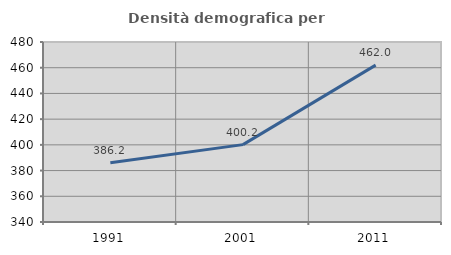
| Category | Densità demografica |
|---|---|
| 1991.0 | 386.158 |
| 2001.0 | 400.174 |
| 2011.0 | 461.997 |